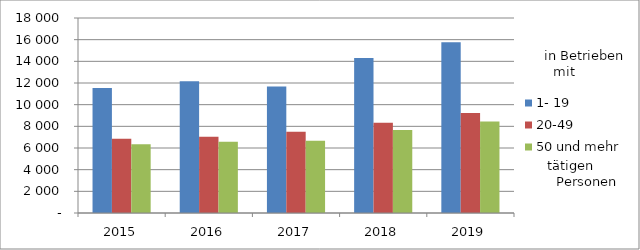
| Category | 1- 19 | 20-49 | 50 und mehr |
|---|---|---|---|
| 2015.0 | 11550 | 6857 | 6353 |
| 2016.0 | 12159 | 7039 | 6566 |
| 2017.0 | 11682 | 7507 | 6671 |
| 2018.0 | 14315 | 8321 | 7663 |
| 2019.0 | 15756 | 9231 | 8442 |